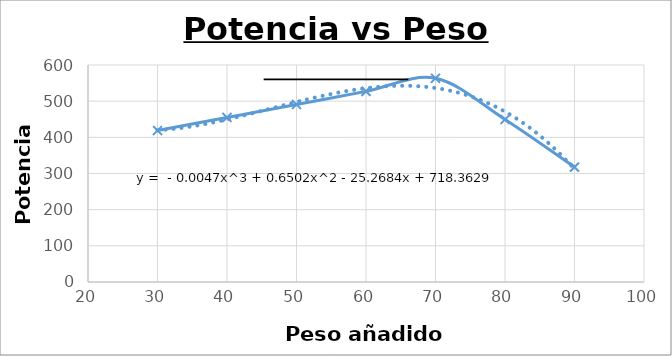
| Category | Series 3 |
|---|---|
| 30.0 | 418.769 |
| 40.0 | 454.87 |
| 50.0 | 490.971 |
| 60.0 | 527.072 |
| 70.0 | 563.172 |
| 80.0 | 449.455 |
| 90.0 | 317.687 |